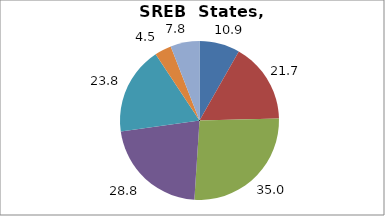
| Category | Series 0 |
|---|---|
| Higher Education | 10.917 |
| Elementary and Secondary Education | 21.742 |
| Total Education1 | 35.041 |
| Social Welfare2 | 28.847 |
| Transportation, Public Safety, Environment and Housing3 | 23.775 |
| Administration | 4.525 |
| Other4 | 7.813 |